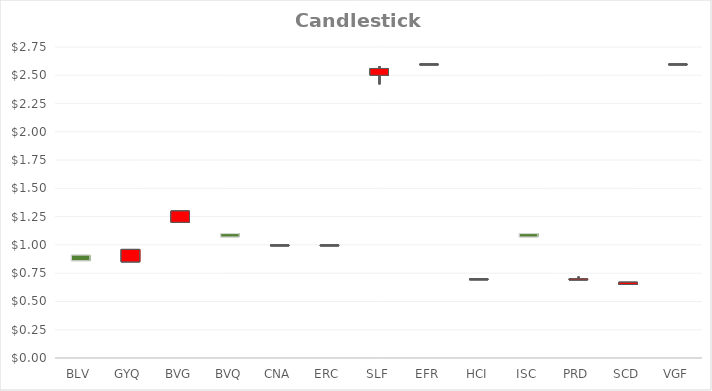
| Category | Open | High | Low | Close |
|---|---|---|---|---|
| BLV | 0.86 | 0.91 | 0.86 | 0.91 |
| GYQ | 0.96 | 0.96 | 0.85 | 0.85 |
| BVG | 1.3 | 1.3 | 1.2 | 1.2 |
| BVQ | 1.07 | 1.1 | 1.07 | 1.1 |
| CNA | 1 | 1 | 1 | 1 |
| ERC | 1 | 1 | 1 | 1 |
| SLF | 2.56 | 2.58 | 2.42 | 2.5 |
| EFR | 2.6 | 2.6 | 2.6 | 2.6 |
| HCI | 0.7 | 0.7 | 0.7 | 0.7 |
| ISC | 1.07 | 1.1 | 1.07 | 1.1 |
| PRD | 0.7 | 0.72 | 0.69 | 0.69 |
| SCD | 0.67 | 0.67 | 0.65 | 0.65 |
| VGF | 2.6 | 2.6 | 2.6 | 2.6 |